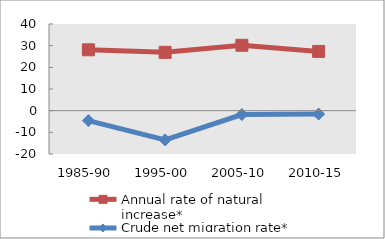
| Category | Annual rate of natural increase* | Crude net migration rate* |
|---|---|---|
| 1985-90 | 28.087 | -4.596 |
| 1995-00 | 26.918 | -13.502 |
| 2005-10 | 30.178 | -1.8 |
| 2010-15 | 27.352 | -1.575 |